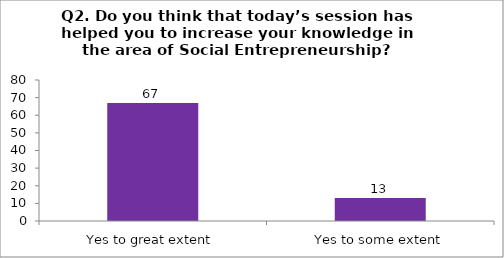
| Category | Q2. Do you think that today’s session have helped you to increase your knowledge in the area of Social Entrepreneurship? |
|---|---|
| Yes to great extent | 67 |
| Yes to some extent | 13 |